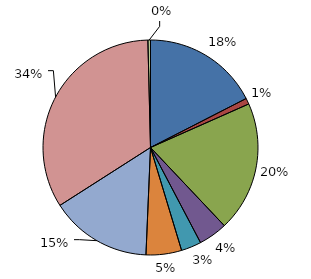
| Category | DF |
|---|---|
| Eau | 1832044866 |
| Aménagement de Zones, Lotissement, Ateliers | 93852538 |
| Économie | 2055459186 |
| Tourisme-Culture-Sport | 455228304 |
| Santé-Social | 318345455 |
| Scolaire | 560736378 |
| Transport | 1601909532 |
| Ordures | 3531518009 |
| Administration | 40579761 |